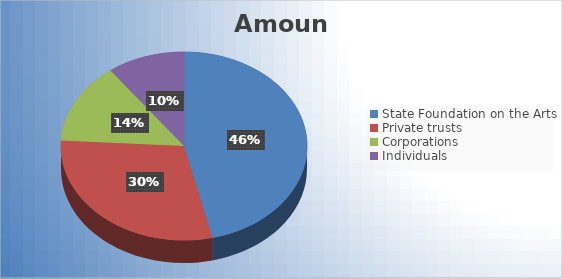
| Category | Amount |
|---|---|
| State Foundation on the Arts | 50000 |
| Private trusts | 32000 |
| Corporations | 15000 |
| Individuals | 11000 |